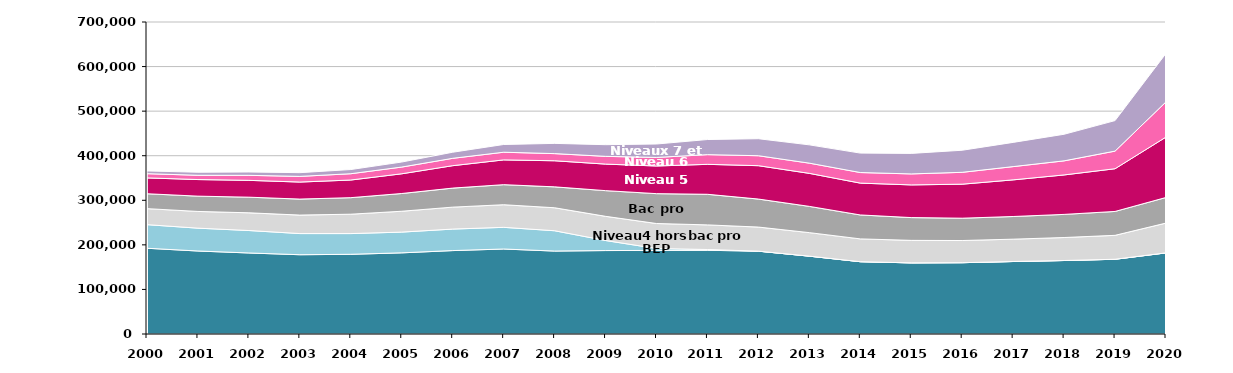
| Category | Niveau 3 hors BEP | BEP | Niveau 4 hors Bac pro | Bac pro | Niveau 5 | Niveau 6 | Niveaux 7 et 8 |
|---|---|---|---|---|---|---|---|
| 2000 | 192359 | 52974 | 35951 | 33404 | 35553 | 9448 | 6185 |
| 2001 | 186202 | 51244 | 37511 | 34317 | 37234 | 9568 | 6852 |
| 2002 | 181771 | 50395 | 39755 | 35047 | 37751 | 11243 | 7514 |
| 2003 | 177845 | 47490 | 41462 | 35900 | 38217 | 12674 | 8378 |
| 2004 | 178807 | 46467 | 43511 | 37112 | 39560 | 14124 | 9407 |
| 2005 | 182059 | 46554 | 46789 | 39820 | 44233 | 15063 | 11341 |
| 2006 | 187137 | 48254 | 49242 | 42709 | 50316 | 16461 | 13690 |
| 2007 | 190690 | 48604 | 50758 | 44995 | 55577 | 17198 | 17340 |
| 2008 | 186059 | 45600 | 51586 | 46884 | 58572 | 16021 | 22928 |
| 2009 | 187228 | 22539 | 54262 | 57638 | 59532 | 17387 | 26156 |
| 2010 | 187537 | 4320 | 55998 | 67020 | 62074 | 19189 | 30142 |
| 2011 | 187797 | 1763 | 55252 | 68636 | 67193 | 21762 | 33931 |
| 2012 | 185875 | 0 | 54022 | 62875 | 74868 | 22321 | 38182 |
| 2013 | 174654 | 0 | 52777 | 58905 | 74048 | 22937 | 41027 |
| 2014 | 162226 | 0 | 51183 | 53697 | 71419 | 23743 | 43614 |
| 2015 | 159610 | 0 | 50470 | 51112 | 73317 | 24655 | 46041 |
| 2016 | 159998 | 0 | 49741 | 50073 | 76326 | 26605 | 49523 |
| 2017 | 162650 | 0 | 50109 | 50843 | 82200 | 29740 | 54364 |
| 2018 | 164874 | 0 | 51594 | 51859 | 88551 | 31582 | 59667 |
| 2019 | 167702 | 0 | 53661 | 53594 | 95860 | 39506 | 68480 |
| 2020 | 182068 | 0 | 66784 | 57452 | 135540 | 78994 | 108797 |